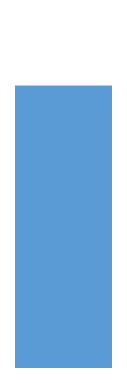
| Category | Men |
|---|---|
| 0 | 0.8 |